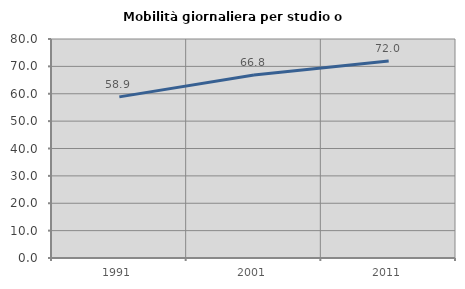
| Category | Mobilità giornaliera per studio o lavoro |
|---|---|
| 1991.0 | 58.858 |
| 2001.0 | 66.828 |
| 2011.0 | 71.959 |